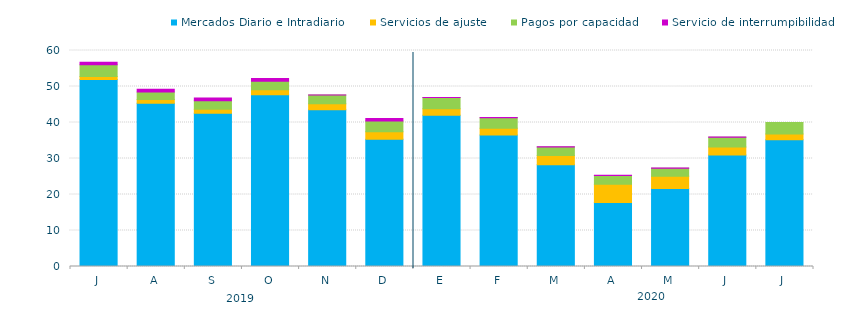
| Category | Mercados Diario e Intradiario  | Servicios de ajuste | Pagos por capacidad | Servicio de interrumpibilidad |
|---|---|---|---|---|
| J | 51.96 | 0.81 | 3.25 | 0.69 |
| A | 45.37 | 1.02 | 2.1 | 0.73 |
| S | 42.58 | 1.08 | 2.38 | 0.78 |
| O | 47.72 | 1.4 | 2.34 | 0.77 |
| N | 43.57 | 1.64 | 2.44 | 0.02 |
| D | 35.33 | 2.07 | 3 | 0.74 |
| E | 42.04 | 1.79 | 3.11 | 0.03 |
| F | 36.51 | 1.87 | 2.97 | 0.04 |
| M | 28.27 | 2.56 | 2.39 | 0.03 |
| A | 17.8 | 5.06 | 2.43 | 0.04 |
| M | 21.68 | 3.37 | 2.24 | 0.04 |
| J | 30.96 | 2.21 | 2.76 | 0.04 |
| J | 35.19 | 1.59 | 3.25 | 0 |